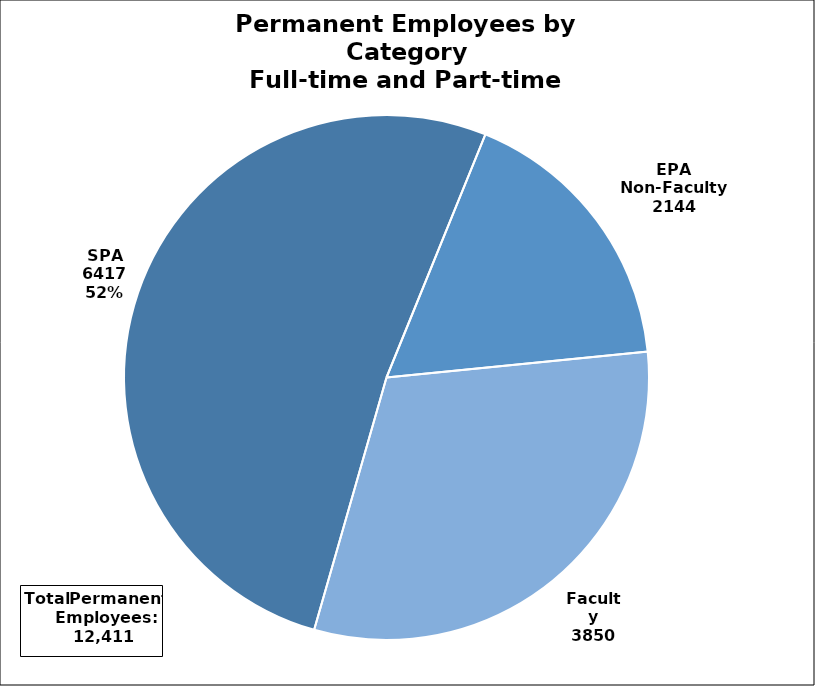
| Category | Employee Type |
|---|---|
| SPA | 6417 |
| EPA Non-Faculty | 2144 |
| Faculty | 3850 |